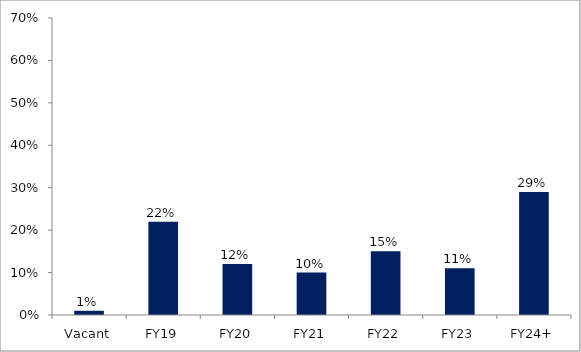
| Category | Series 0 |
|---|---|
| Vacant | 0.01 |
| FY19 | 0.22 |
| FY20 | 0.12 |
| FY21 | 0.1 |
| FY22 | 0.15 |
| FY23 | 0.11 |
| FY24+ | 0.29 |